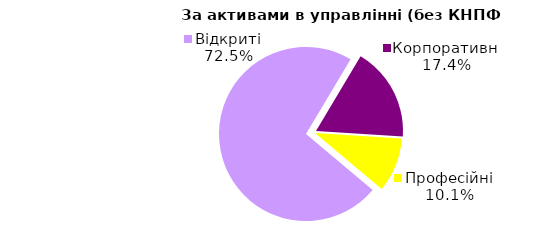
| Category | Series 0 |
|---|---|
| Відкриті | 916.276 |
| Корпоративні | 220.477 |
| Професійні | 127.85 |